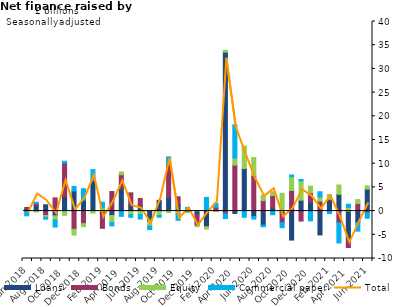
| Category | Loans | Bonds | Equity | Commercial paper |
|---|---|---|---|---|
| Jun-2018 | 0.474 | 0.294 | -0.02 | -0.977 |
| Jul-2018 | 1.138 | 0.494 | -0.155 | 0.233 |
| Aug-2018 | 1.335 | -0.932 | -0.344 | -0.431 |
| Sep-2018 | -0.989 | 2.795 | -0.891 | -1.484 |
| Oct-2018 | 3.018 | 7.138 | -0.895 | 0.363 |
| Nov-2018 | 4.25 | -3.846 | -1.212 | 0.958 |
| Dec-2018 | 2.314 | -2.65 | -0.63 | 2.407 |
| Jan-2019 | 6.273 | 0.161 | -0.433 | 2.312 |
| Feb-2019 | -0.548 | -3.084 | 0.688 | 1.181 |
| Mar-2019 | -0.926 | 4.131 | -1.501 | -0.683 |
| Apr-2019 | 4.756 | 2.92 | 0.573 | -1.109 |
| May-2019 | 1.23 | 2.622 | -0.747 | -0.561 |
| Jun-2019 | 1.214 | 1.437 | -0.681 | -1.001 |
| Jul-2019 | -1.856 | -0.281 | -1.025 | -0.742 |
| Aug-2019 | 2.099 | 0.174 | -0.936 | -0.357 |
| Sep-2019 | 2.911 | 6.981 | -0.28 | 1.548 |
| Oct-2019 | 1.37 | 1.651 | -0.529 | -1.416 |
| Nov-2019 | 0.105 | -0.195 | -0.116 | 0.654 |
| Dec-2019 | -0.643 | -2.415 | -0.213 | 0.031 |
| Jan-2020 | -3.29 | 0.155 | -0.494 | 2.731 |
| Feb-2020 | 0.033 | 0.764 | -0.081 | 0.826 |
| Mar-2020 | 33.538 | -0.54 | 0.373 | -1.041 |
| Apr-2020 | -0.495 | 9.698 | 1.49 | 7.014 |
| May-2020 | 8.87 | 0.131 | 4.705 | -1.303 |
| Jun-2020 | -1.118 | 7.494 | 3.8 | -0.564 |
| Jul-2020 | -2.971 | 2.212 | 1.098 | -0.34 |
| Aug-2020 | 0.678 | 2.614 | 0.783 | -0.762 |
| Sep-2020 | -0.32 | -2.122 | 3.767 | -1.058 |
| Oct-2020 | -6.113 | 4.349 | 2.908 | 0.366 |
| Nov-2020 | 2.295 | -2.106 | 4.065 | 0.327 |
| Dec-2020 | 1.865 | 2.015 | 1.384 | -2.076 |
| Jan-2021 | -5.035 | 2.081 | 0.893 | 1.11 |
| Feb-2021 | 2.322 | 0.193 | 0.967 | -0.517 |
| Mar-2021 | 3.537 | -2.452 | 1.965 | -4.272 |
| Apr-2021 | -5.931 | -1.754 | 0.801 | 0.65 |
| May-2021 | -2.412 | 1.596 | 0.855 | -1.817 |
| Jun-2021 | 4.646 | -0.338 | 0.68 | -1.166 |